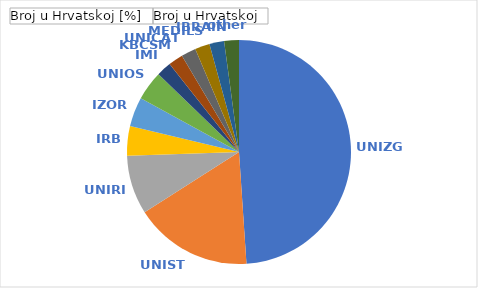
| Category | Broj u Hrvatskoj [%] | Broj u Hrvatskoj |
|---|---|---|
| UNIZG | 0.489 | 23 |
| UNIST | 0.17 | 8 |
| UNIRI | 0.085 | 4 |
| IRB | 0.043 | 2 |
| IZOR | 0.043 | 2 |
| UNIOS | 0.043 | 2 |
| IMI | 0.021 | 1 |
| KBCSM | 0.021 | 1 |
| UNICATH | 0.021 | 1 |
| MEDILS | 0.021 | 1 |
| IBRAIN | 0.021 | 1 |
| other | 0.021 | 1 |